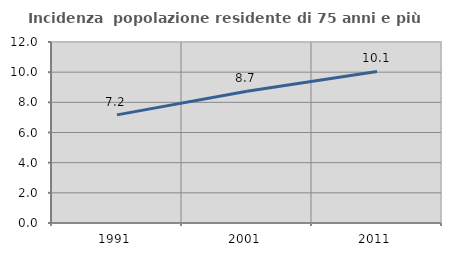
| Category | Incidenza  popolazione residente di 75 anni e più |
|---|---|
| 1991.0 | 7.168 |
| 2001.0 | 8.732 |
| 2011.0 | 10.051 |